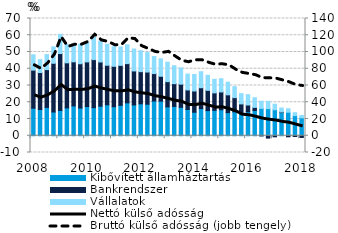
| Category | Kibővített államháztartás | Bankrendszer | Vállalatok |
|---|---|---|---|
| 2008.0 | 16.458 | 22.717 | 9.14 |
| 2008.0 | 15.678 | 22.055 | 7.675 |
| 2008.0 | 16.911 | 22.584 | 8.93 |
| 2008.0 | 14.165 | 29.091 | 9.81 |
| 2009.0 | 15.12 | 33.952 | 11.428 |
| 2009.0 | 16.633 | 26.901 | 10.915 |
| 2009.0 | 17.803 | 26.337 | 10.762 |
| 2009.0 | 16.57 | 26.423 | 11.68 |
| 2010.0 | 17.44 | 26.648 | 11.56 |
| 2010.0 | 16.789 | 28.67 | 13.269 |
| 2010.0 | 17.654 | 26.372 | 12.438 |
| 2010.0 | 18.488 | 23.599 | 12.53 |
| 2011.0 | 17.326 | 24.136 | 11.631 |
| 2011.0 | 18.16 | 23.834 | 10.999 |
| 2011.0 | 19.654 | 23.412 | 11.221 |
| 2011.0 | 18.396 | 20.305 | 13.058 |
| 2012.0 | 19.065 | 19.204 | 12.504 |
| 2012.0 | 18.824 | 19.213 | 11.61 |
| 2012.0 | 20.746 | 16.378 | 10.159 |
| 2012.0 | 20.671 | 14.844 | 10.407 |
| 2013.0 | 17.237 | 15.065 | 11.622 |
| 2013.0 | 17.514 | 13.574 | 10.72 |
| 2013.0 | 16.981 | 13.818 | 9.731 |
| 2013.0 | 15.691 | 11.651 | 9.472 |
| 2014.0 | 14.036 | 12.686 | 9.85 |
| 2014.0 | 16.184 | 12.491 | 9.552 |
| 2014.0 | 15.007 | 12.102 | 8.952 |
| 2014.0 | 15.185 | 10.409 | 8.114 |
| 2015.0 | 15.517 | 10.639 | 7.886 |
| 2015.0 | 13.799 | 10.641 | 7.534 |
| 2015.0 | 14.281 | 8.468 | 6.565 |
| 2015.0 | 13.228 | 5.779 | 6.14 |
| 2016.0 | 14.317 | 4.04 | 6.154 |
| 2016.0 | 15.082 | 1.844 | 5.758 |
| 2016.0 | 16.322 | -0.085 | 4.28 |
| 2016.0 | 16.18 | -1.412 | 4.388 |
| 2017.0 | 15.523 | -0.633 | 3.307 |
| 2017.0 | 13.807 | 0.353 | 2.408 |
| 2017.0 | 14.058 | -0.619 | 2.054 |
| 2017.0 | 12.027 | -0.438 | 1.742 |
| 2018.0 | 10.663 | -1.028 | 1.47 |